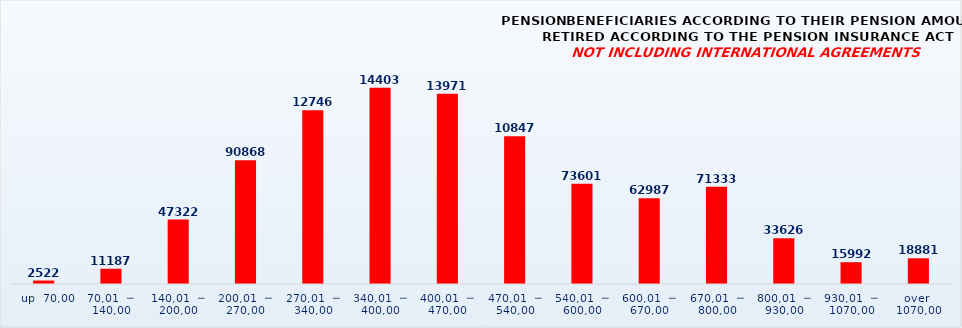
| Category | PENSION BENEFICIARIES ACCORDING TO TYPES AND AMOUNTS OF PENSION, RETIRED ACCORDING TO THE PENSION INSURANCE ACT
NOT INCLUDING INTERNATIONAL AGREEMENTS |
|---|---|
|   up  70,00 | 2522 |
| 70,01  ─  140,00 | 11187 |
| 140,01  ─  200,00 | 47322 |
| 200,01  ─  270,00 | 90868 |
| 270,01  ─  340,00 | 127467 |
| 340,01  ─  400,00 | 144030 |
| 400,01  ─  470,00 | 139718 |
| 470,01  ─  540,00 | 108476 |
| 540,01  ─  600,00 | 73601 |
| 600,01  ─  670,00 | 62987 |
| 670,01  ─  800,00 | 71333 |
| 800,01  ─  930,00 | 33626 |
| 930,01  ─  1070,00 | 15992 |
| over  1070,00 | 18881 |